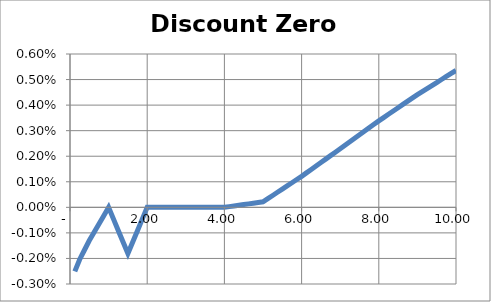
| Category | Zero |
|---|---|
| 0.125 | -0.003 |
| 0.25 | -0.002 |
| 0.375 | -0.002 |
| 0.5 | -0.001 |
| 0.625 | -0.001 |
| 0.75 | -0.001 |
| 0.875 | 0 |
| 1.0 | 0 |
| 1.125 | 0 |
| 1.25 | -0.001 |
| 1.375 | -0.001 |
| 1.5 | -0.002 |
| 1.625 | -0.001 |
| 1.75 | -0.001 |
| 1.875 | 0 |
| 2.0 | 0 |
| 2.125 | 0 |
| 2.25 | 0 |
| 2.375 | 0 |
| 2.5 | 0 |
| 2.625 | 0 |
| 2.75 | 0 |
| 2.875 | 0 |
| 3.0 | 0 |
| 3.125 | 0 |
| 3.25 | 0 |
| 3.375 | 0 |
| 3.5 | 0 |
| 3.625 | 0 |
| 3.75 | 0 |
| 3.875 | 0 |
| 4.0 | 0 |
| 4.125 | 0 |
| 4.25 | 0 |
| 4.375 | 0 |
| 4.5 | 0 |
| 4.625 | 0 |
| 4.75 | 0 |
| 4.875 | 0 |
| 5.0 | 0 |
| 5.125 | 0 |
| 5.25 | 0 |
| 5.375 | 0.001 |
| 5.5 | 0.001 |
| 5.625 | 0.001 |
| 5.75 | 0.001 |
| 5.875 | 0.001 |
| 6.0 | 0.001 |
| 6.125 | 0.001 |
| 6.25 | 0.001 |
| 6.375 | 0.002 |
| 6.5 | 0.002 |
| 6.625 | 0.002 |
| 6.75 | 0.002 |
| 6.875 | 0.002 |
| 7.0 | 0.002 |
| 7.125 | 0.002 |
| 7.25 | 0.003 |
| 7.375 | 0.003 |
| 7.5 | 0.003 |
| 7.625 | 0.003 |
| 7.75 | 0.003 |
| 7.875 | 0.003 |
| 8.0 | 0.003 |
| 8.125 | 0.004 |
| 8.25 | 0.004 |
| 8.375 | 0.004 |
| 8.5 | 0.004 |
| 8.625 | 0.004 |
| 8.75 | 0.004 |
| 8.875 | 0.004 |
| 9.0 | 0.004 |
| 9.125 | 0.005 |
| 9.25 | 0.005 |
| 9.375 | 0.005 |
| 9.5 | 0.005 |
| 9.625 | 0.005 |
| 9.75 | 0.005 |
| 9.875 | 0.005 |
| 10.0 | 0.005 |